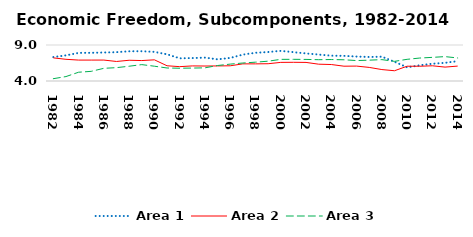
| Category | Area 1 | Area 2 | Area 3 |
|---|---|---|---|
| 1982.0 | 7.326 | 7.211 | 4.32 |
| 1983.0 | 7.562 | 7.014 | 4.615 |
| 1984.0 | 7.904 | 6.904 | 5.218 |
| 1985.0 | 7.916 | 6.906 | 5.341 |
| 1986.0 | 7.957 | 6.907 | 5.763 |
| 1987.0 | 8.004 | 6.711 | 5.855 |
| 1988.0 | 8.126 | 6.882 | 6.051 |
| 1989.0 | 8.137 | 6.839 | 6.275 |
| 1990.0 | 8.047 | 6.939 | 6.054 |
| 1991.0 | 7.71 | 6.115 | 5.806 |
| 1992.0 | 7.152 | 5.993 | 5.774 |
| 1993.0 | 7.186 | 6.096 | 5.797 |
| 1994.0 | 7.247 | 6.081 | 5.826 |
| 1995.0 | 7.008 | 6.092 | 6.153 |
| 1996.0 | 7.202 | 6.114 | 6.344 |
| 1997.0 | 7.666 | 6.38 | 6.499 |
| 1998.0 | 7.92 | 6.379 | 6.613 |
| 1999.0 | 8.029 | 6.399 | 6.753 |
| 2000.0 | 8.188 | 6.585 | 7.006 |
| 2001.0 | 8.007 | 6.596 | 7.011 |
| 2002.0 | 7.827 | 6.581 | 6.998 |
| 2003.0 | 7.671 | 6.333 | 6.959 |
| 2004.0 | 7.516 | 6.288 | 6.981 |
| 2005.0 | 7.493 | 6.056 | 6.946 |
| 2006.0 | 7.393 | 6.072 | 6.839 |
| 2007.0 | 7.334 | 5.888 | 6.893 |
| 2008.0 | 7.38 | 5.587 | 6.968 |
| 2009.0 | 6.671 | 5.425 | 6.73 |
| 2010.0 | 5.896 | 6.054 | 7.011 |
| 2011.0 | 6.18 | 6.05 | 7.189 |
| 2012.0 | 6.395 | 6.114 | 7.282 |
| 2013.0 | 6.525 | 5.93 | 7.388 |
| 2014.0 | 6.76 | 6.072 | 7.198 |